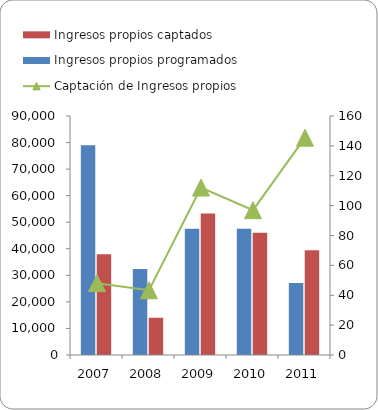
| Category | Ingresos propios programados | Ingresos propios captados  |
|---|---|---|
| 2007 | 78961 | 37984 |
| 2008 | 32374.5 | 14026 |
| 2009 | 47500 | 53245 |
| 2010 | 47500 | 46050 |
| 2011 | 27094.912 | 39418.56 |